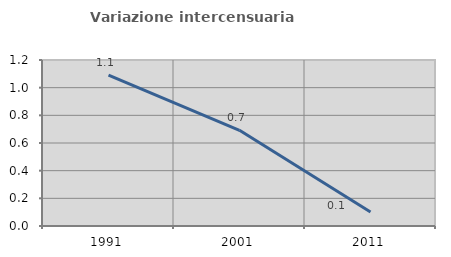
| Category | Variazione intercensuaria annua |
|---|---|
| 1991.0 | 1.092 |
| 2001.0 | 0.692 |
| 2011.0 | 0.101 |